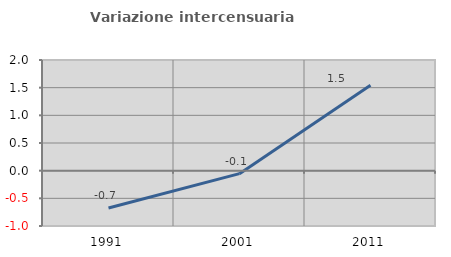
| Category | Variazione intercensuaria annua |
|---|---|
| 1991.0 | -0.675 |
| 2001.0 | -0.054 |
| 2011.0 | 1.542 |